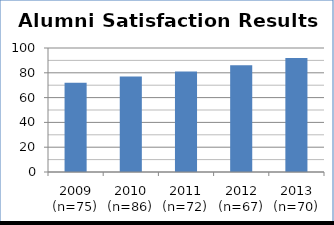
| Category | Alumni Satisfaction Results |
|---|---|
| 2009 (n=75) | 72 |
| 2010 (n=86) | 77 |
| 2011 (n=72) | 81 |
| 2012 (n=67) | 86 |
| 2013 (n=70) | 92 |